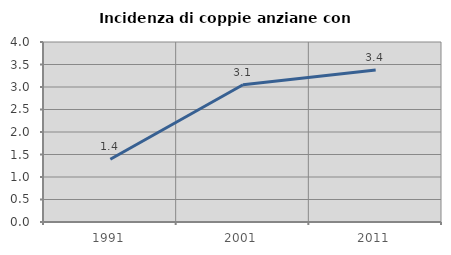
| Category | Incidenza di coppie anziane con figli |
|---|---|
| 1991.0 | 1.395 |
| 2001.0 | 3.05 |
| 2011.0 | 3.378 |